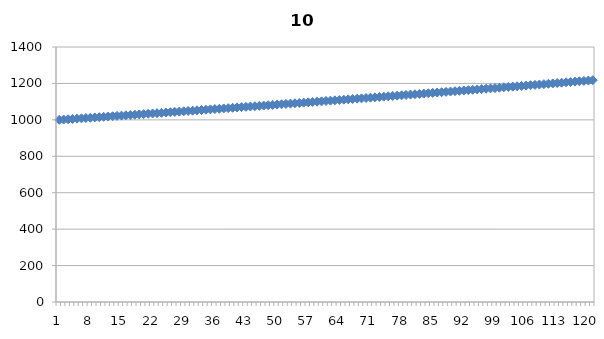
| Category | Series 0 |
|---|---|
| 0 | 1000 |
| 1 | 1001.644 |
| 2 | 1003.29 |
| 3 | 1004.94 |
| 4 | 1006.592 |
| 5 | 1008.246 |
| 6 | 1009.904 |
| 7 | 1011.564 |
| 8 | 1013.227 |
| 9 | 1014.892 |
| 10 | 1016.56 |
| 11 | 1018.232 |
| 12 | 1019.905 |
| 13 | 1021.582 |
| 14 | 1023.261 |
| 15 | 1024.943 |
| 16 | 1026.628 |
| 17 | 1028.316 |
| 18 | 1030.006 |
| 19 | 1031.699 |
| 20 | 1033.395 |
| 21 | 1035.094 |
| 22 | 1036.795 |
| 23 | 1038.5 |
| 24 | 1040.207 |
| 25 | 1041.917 |
| 26 | 1043.63 |
| 27 | 1045.345 |
| 28 | 1047.064 |
| 29 | 1048.785 |
| 30 | 1050.509 |
| 31 | 1052.236 |
| 32 | 1053.965 |
| 33 | 1055.698 |
| 34 | 1057.433 |
| 35 | 1059.172 |
| 36 | 1060.913 |
| 37 | 1062.657 |
| 38 | 1064.403 |
| 39 | 1066.153 |
| 40 | 1067.906 |
| 41 | 1069.661 |
| 42 | 1071.42 |
| 43 | 1073.181 |
| 44 | 1074.945 |
| 45 | 1076.712 |
| 46 | 1078.482 |
| 47 | 1080.255 |
| 48 | 1082.03 |
| 49 | 1083.809 |
| 50 | 1085.591 |
| 51 | 1087.375 |
| 52 | 1089.163 |
| 53 | 1090.953 |
| 54 | 1092.746 |
| 55 | 1094.543 |
| 56 | 1096.342 |
| 57 | 1098.144 |
| 58 | 1099.949 |
| 59 | 1101.758 |
| 60 | 1103.569 |
| 61 | 1105.383 |
| 62 | 1107.2 |
| 63 | 1109.02 |
| 64 | 1110.843 |
| 65 | 1112.669 |
| 66 | 1114.498 |
| 67 | 1116.33 |
| 68 | 1118.165 |
| 69 | 1120.003 |
| 70 | 1121.844 |
| 71 | 1123.688 |
| 72 | 1125.536 |
| 73 | 1127.386 |
| 74 | 1129.239 |
| 75 | 1131.095 |
| 76 | 1132.955 |
| 77 | 1134.817 |
| 78 | 1136.682 |
| 79 | 1138.551 |
| 80 | 1140.423 |
| 81 | 1142.297 |
| 82 | 1144.175 |
| 83 | 1146.056 |
| 84 | 1147.94 |
| 85 | 1149.827 |
| 86 | 1151.717 |
| 87 | 1153.61 |
| 88 | 1155.506 |
| 89 | 1157.406 |
| 90 | 1159.309 |
| 91 | 1161.214 |
| 92 | 1163.123 |
| 93 | 1165.035 |
| 94 | 1166.95 |
| 95 | 1168.868 |
| 96 | 1170.79 |
| 97 | 1172.714 |
| 98 | 1174.642 |
| 99 | 1176.573 |
| 100 | 1178.507 |
| 101 | 1180.445 |
| 102 | 1182.385 |
| 103 | 1184.329 |
| 104 | 1186.275 |
| 105 | 1188.226 |
| 106 | 1190.179 |
| 107 | 1192.135 |
| 108 | 1194.095 |
| 109 | 1196.058 |
| 110 | 1198.024 |
| 111 | 1199.993 |
| 112 | 1201.966 |
| 113 | 1203.942 |
| 114 | 1205.921 |
| 115 | 1207.903 |
| 116 | 1209.889 |
| 117 | 1211.878 |
| 118 | 1213.87 |
| 119 | 1215.865 |
| 120 | 1217.864 |